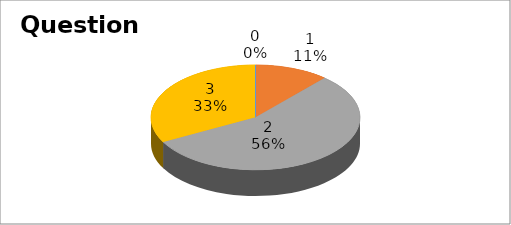
| Category | Series 0 |
|---|---|
| 0 | 0 |
| 1 | 15 |
| 2 | 73 |
| 3 | 43 |